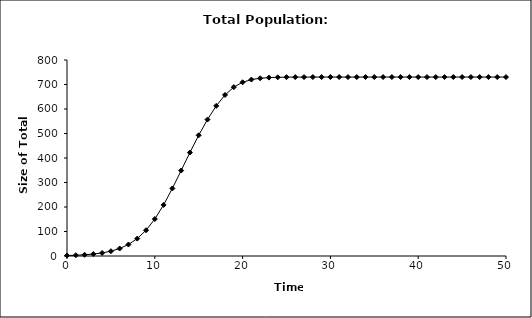
| Category | Total pop |
|---|---|
| 0.0 | 2 |
| 1.0 | 3.16 |
| 2.0 | 5.004 |
| 3.0 | 7.917 |
| 4.0 | 12.485 |
| 5.0 | 19.587 |
| 6.0 | 30.488 |
| 7.0 | 46.915 |
| 8.0 | 71.015 |
| 9.0 | 105.078 |
| 10.0 | 150.849 |
| 11.0 | 208.516 |
| 12.0 | 275.908 |
| 13.0 | 348.777 |
| 14.0 | 422.327 |
| 15.0 | 492.68 |
| 16.0 | 557.009 |
| 17.0 | 612.768 |
| 18.0 | 657.386 |
| 19.0 | 689.247 |
| 20.0 | 709.108 |
| 21.0 | 720.026 |
| 22.0 | 725.517 |
| 23.0 | 728.139 |
| 24.0 | 729.357 |
| 25.0 | 729.915 |
| 26.0 | 730.168 |
| 27.0 | 730.283 |
| 28.0 | 730.334 |
| 29.0 | 730.357 |
| 30.0 | 730.368 |
| 31.0 | 730.372 |
| 32.0 | 730.375 |
| 33.0 | 730.375 |
| 34.0 | 730.376 |
| 35.0 | 730.376 |
| 36.0 | 730.376 |
| 37.0 | 730.376 |
| 38.0 | 730.376 |
| 39.0 | 730.376 |
| 40.0 | 730.376 |
| 41.0 | 730.376 |
| 42.0 | 730.376 |
| 43.0 | 730.376 |
| 44.0 | 730.376 |
| 45.0 | 730.376 |
| 46.0 | 730.376 |
| 47.0 | 730.376 |
| 48.0 | 730.376 |
| 49.0 | 730.376 |
| 50.0 | 730.376 |